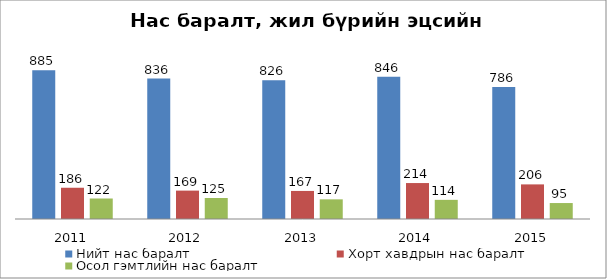
| Category | Нийт нас баралт | Хорт хавдрын нас баралт | Осол гэмтлийн нас баралт |
|---|---|---|---|
| 2011.0 | 885 | 186 | 122 |
| 2012.0 | 836 | 169 | 125 |
| 2013.0 | 826 | 167 | 117 |
| 2014.0 | 846 | 214 | 114 |
| 2015.0 | 786 | 206 | 95 |